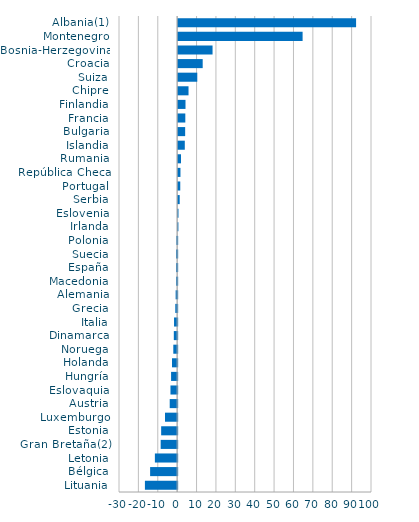
| Category | Series 0 |
|---|---|
| Lituania | -16.632 |
| Bélgica | -13.947 |
| Letonia | -11.491 |
| Gran Bretaña(2) | -8.504 |
| Estonia | -8.251 |
| Luxemburgo | -6.268 |
| Austria | -3.84 |
| Eslovaquia | -3.448 |
| Hungría | -3.129 |
| Holanda | -2.655 |
| Noruega | -1.983 |
| Dinamarca | -1.725 |
| Italia | -1.606 |
| Grecia | -0.961 |
| Alemania | -0.784 |
| Macedonia | -0.513 |
| España | -0.508 |
| Suecia | -0.505 |
| Polonia | -0.382 |
| Irlanda | 0.124 |
| Eslovenia | 0.167 |
| Serbia | 0.795 |
| Portugal | 1.087 |
| República Checa | 1.188 |
| Rumania | 1.474 |
| Islandia | 3.426 |
| Bulgaria | 3.616 |
| Francia | 3.695 |
| Finlandia | 3.79 |
| Chipre | 5.349 |
| Suiza | 9.864 |
| Croacia | 12.658 |
| Bosnia-Herzegovina | 17.746 |
| Montenegro | 64.199 |
| Albania(1) | 91.793 |